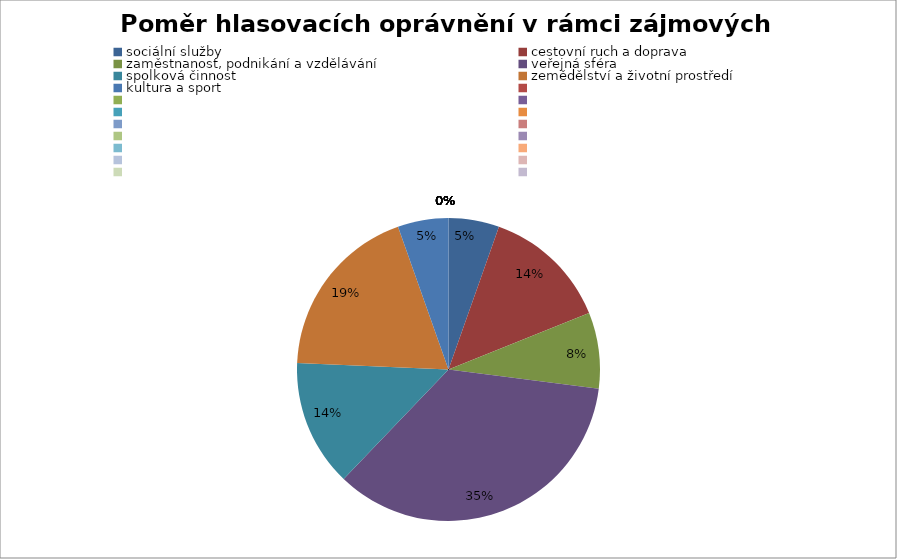
| Category | Series 0 |
|---|---|
| sociální služby | 0.054 |
| cestovní ruch a doprava | 0.135 |
| zaměstnanost, podnikání a vzdělávání | 0.081 |
| veřejná sféra | 0.351 |
| spolková činnost | 0.135 |
| zemědělství a životní prostředí | 0.189 |
| kultura a sport | 0.054 |